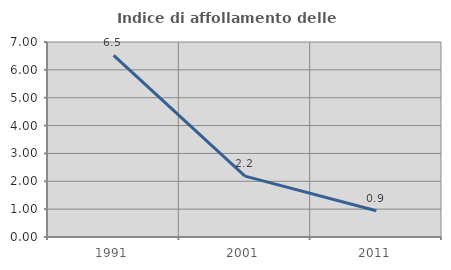
| Category | Indice di affollamento delle abitazioni  |
|---|---|
| 1991.0 | 6.519 |
| 2001.0 | 2.187 |
| 2011.0 | 0.945 |